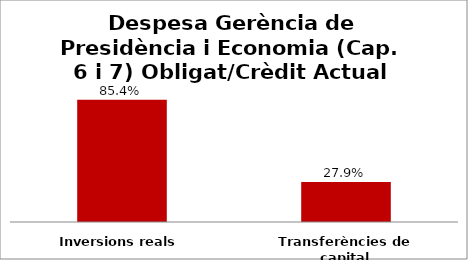
| Category | Series 0 |
|---|---|
| Inversions reals | 0.854 |
| Transferències de capital | 0.279 |